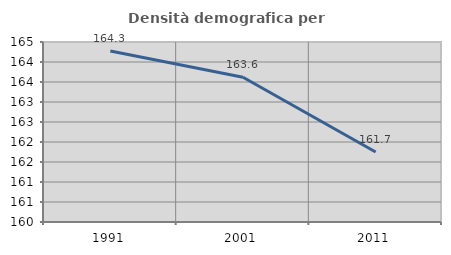
| Category | Densità demografica |
|---|---|
| 1991.0 | 164.274 |
| 2001.0 | 163.619 |
| 2011.0 | 161.748 |